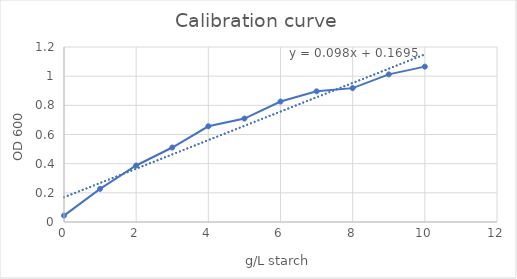
| Category | Series 0 |
|---|---|
| 0.0 | 0.044 |
| 1.0 | 0.227 |
| 2.0 | 0.388 |
| 3.0 | 0.511 |
| 4.0 | 0.656 |
| 5.0 | 0.709 |
| 6.0 | 0.826 |
| 7.0 | 0.896 |
| 8.0 | 0.918 |
| 9.0 | 1.012 |
| 10.0 | 1.065 |